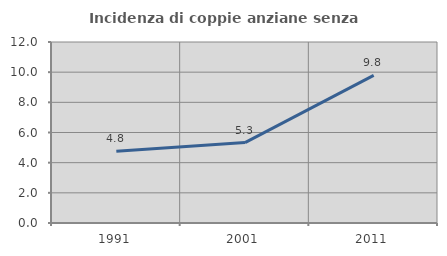
| Category | Incidenza di coppie anziane senza figli  |
|---|---|
| 1991.0 | 4.755 |
| 2001.0 | 5.33 |
| 2011.0 | 9.786 |